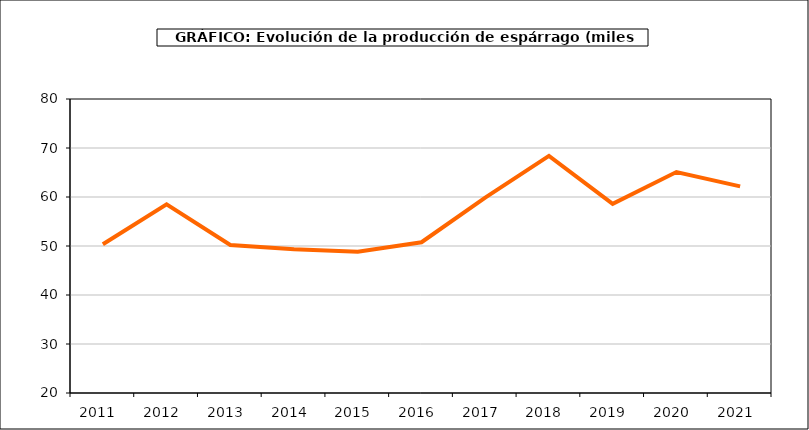
| Category | producción |
|---|---|
| 2011.0 | 50.362 |
| 2012.0 | 58.496 |
| 2013.0 | 50.212 |
| 2014.0 | 49.352 |
| 2015.0 | 48.814 |
| 2016.0 | 50.771 |
| 2017.0 | 59.869 |
| 2018.0 | 68.403 |
| 2019.0 | 58.605 |
| 2020.0 | 65.094 |
| 2021.0 | 62.174 |